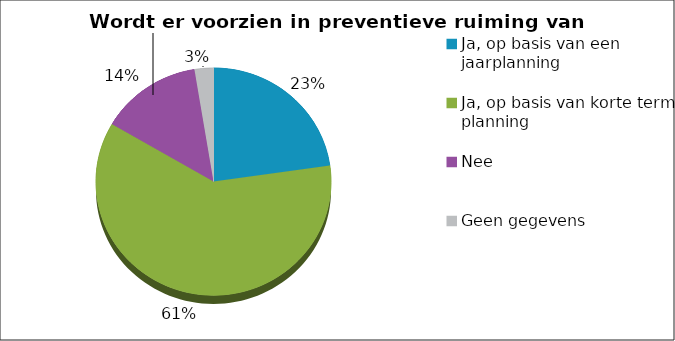
| Category | Series 0 |
|---|---|
| Ja, op basis van een jaarplanning | 70 |
| Ja, op basis van korte termijn planning | 187 |
| Nee | 43 |
| Geen gegevens | 8 |